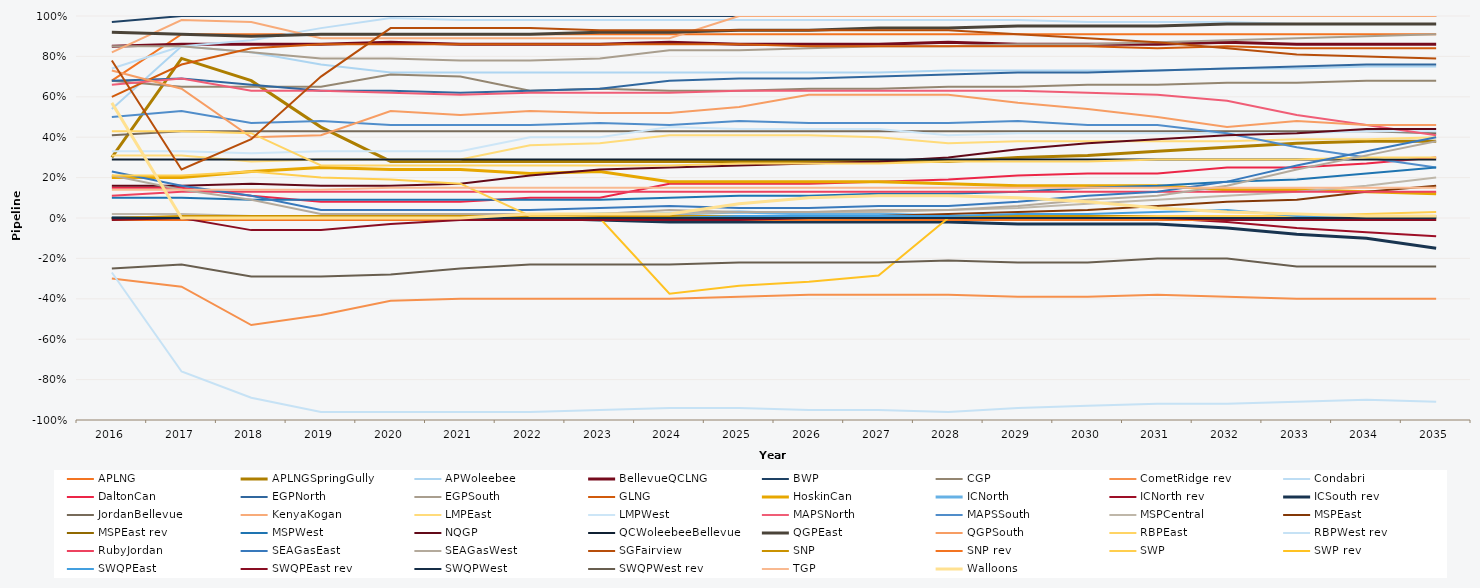
| Category | APLNG | APLNGSpringGully | APWoleebee | BellevueQCLNG | BWP | CGP | CometRidge rev | Condabri | DaltonCan | EGPNorth | EGPSouth | GLNG | HoskinCan | ICNorth | ICNorth rev | ICSouth rev | JordanBellevue | KenyaKogan | LMPEast | LMPWest | MAPSNorth | MAPSSouth | MSPCentral | MSPEast | MSPEast rev | MSPWest | NQGP | QCWoleebeeBellevue | QGPEast | QGPSouth | RBPEast | RBPWest rev | RubyJordan | SEAGasEast | SEAGasWest | SGFairview | SNP | SNP rev | SWP | SWP rev | SWQPEast | SWQPEast rev | SWQPWest | SWQPWest rev | TGP | Walloons |
|---|---|---|---|---|---|---|---|---|---|---|---|---|---|---|---|---|---|---|---|---|---|---|---|---|---|---|---|---|---|---|---|---|---|---|---|---|---|---|---|---|---|---|---|---|---|---|
| 2016.0 | 0.68 | 0.3 | 0.54 | 0.85 | 0.97 | 0.68 | -0.3 | 0.74 | 0.15 | 0.68 | 0.85 | 0.6 | 0.2 | 0 | 0 | 0 | 0.41 | 0.82 | 0.31 | 0.33 | 0.66 | 0.5 | 0.02 | 0 | 0 | 0.1 | 0.16 | 0.29 | 0.92 | 0.73 | 0.43 | -0.27 | 0.11 | 0.23 | 0.21 | 0.78 | 0 | -0.01 | 0.21 | 0 | 0 | -0.01 | 0 | -0.25 | 0.14 | 0.57 |
| 2017.0 | 0.91 | 0.79 | 0.85 | 0.86 | 1 | 0.65 | -0.34 | 0.85 | 0.15 | 0.69 | 0.85 | 0.76 | 0.2 | 0 | 0 | 0 | 0.43 | 0.98 | 0.31 | 0.33 | 0.69 | 0.53 | 0.02 | 0 | 0 | 0.1 | 0.16 | 0.29 | 0.91 | 0.64 | 0.43 | -0.76 | 0.13 | 0.16 | 0.14 | 0.24 | 0.01 | -0.01 | 0.21 | 0 | 0 | 0 | 0 | -0.23 | 0.14 | 0 |
| 2018.0 | 0.91 | 0.68 | 0.82 | 0.86 | 1 | 0.65 | -0.53 | 0.88 | 0.11 | 0.66 | 0.82 | 0.84 | 0.23 | 0 | 0 | 0 | 0.43 | 0.97 | 0.28 | 0.32 | 0.63 | 0.47 | 0.01 | 0 | 0 | 0.09 | 0.17 | 0.29 | 0.9 | 0.4 | 0.42 | -0.89 | 0.13 | 0.11 | 0.09 | 0.39 | 0.01 | -0.01 | 0.23 | 0 | 0 | -0.06 | 0 | -0.29 | 0.14 | 0 |
| 2019.0 | 0.91 | 0.45 | 0.76 | 0.86 | 1 | 0.65 | -0.48 | 0.94 | 0.08 | 0.63 | 0.79 | 0.86 | 0.25 | 0 | 0 | 0 | 0.43 | 0.89 | 0.29 | 0.33 | 0.63 | 0.48 | 0.01 | 0 | 0 | 0.09 | 0.16 | 0.29 | 0.91 | 0.41 | 0.26 | -0.96 | 0.13 | 0.04 | 0.02 | 0.7 | 0.01 | -0.01 | 0.2 | 0 | 0 | -0.06 | 0 | -0.29 | 0.14 | 0 |
| 2020.0 | 0.91 | 0.28 | 0.72 | 0.87 | 1 | 0.71 | -0.41 | 0.99 | 0.08 | 0.63 | 0.79 | 0.86 | 0.24 | 0 | 0 | 0 | 0.43 | 0.89 | 0.29 | 0.33 | 0.62 | 0.46 | 0.01 | 0 | 0 | 0.09 | 0.16 | 0.29 | 0.91 | 0.53 | 0.26 | -0.96 | 0.13 | 0.04 | 0.02 | 0.94 | 0.01 | -0.01 | 0.19 | 0 | 0 | -0.03 | 0 | -0.28 | 0.15 | 0 |
| 2021.0 | 0.91 | 0.28 | 0.72 | 0.86 | 1 | 0.7 | -0.4 | 0.98 | 0.08 | 0.62 | 0.78 | 0.86 | 0.24 | 0 | 0 | 0 | 0.43 | 0.89 | 0.29 | 0.33 | 0.61 | 0.46 | 0.01 | 0 | 0 | 0.09 | 0.17 | 0.29 | 0.91 | 0.51 | 0.26 | -0.96 | 0.13 | 0.04 | 0.02 | 0.94 | 0.01 | -0.01 | 0.17 | 0 | 0 | -0.01 | 0 | -0.25 | 0.15 | 0 |
| 2022.0 | 0.91 | 0.28 | 0.72 | 0.86 | 1 | 0.63 | -0.4 | 0.98 | 0.1 | 0.63 | 0.78 | 0.86 | 0.22 | 0.01 | 0 | 0 | 0.43 | 0.89 | 0.36 | 0.4 | 0.62 | 0.46 | 0.01 | 0 | 0 | 0.09 | 0.21 | 0.29 | 0.91 | 0.53 | 0.26 | -0.96 | 0.13 | 0.04 | 0.02 | 0.94 | 0.01 | -0.01 | 0.01 | 0 | 0 | -0.01 | 0 | -0.23 | 0.15 | 0.02 |
| 2023.0 | 0.91 | 0.28 | 0.72 | 0.86 | 1 | 0.64 | -0.4 | 0.98 | 0.1 | 0.64 | 0.79 | 0.86 | 0.23 | 0.02 | 0 | -0.01 | 0.43 | 0.89 | 0.37 | 0.4 | 0.62 | 0.47 | 0.01 | 0 | 0 | 0.09 | 0.24 | 0.29 | 0.92 | 0.52 | 0.26 | -0.95 | 0.13 | 0.05 | 0.02 | 0.93 | 0.01 | -0.01 | 0 | 0 | 0 | -0.01 | 0 | -0.23 | 0.15 | 0.02 |
| 2024.0 | 0.91 | 0.28 | 0.72 | 0.87 | 1 | 0.63 | -0.4 | 0.98 | 0.17 | 0.68 | 0.83 | 0.86 | 0.18 | 0.02 | 0 | -0.02 | 0.43 | 0.89 | 0.41 | 0.45 | 0.62 | 0.46 | 0.02 | 0 | 0 | 0.1 | 0.25 | 0.29 | 0.92 | 0.52 | 0.26 | -0.94 | 0.13 | 0.06 | 0.04 | 0.93 | 0.01 | -0.01 | 0 | -0.375 | 0 | -0.01 | 0 | -0.23 | 0.15 | 0.02 |
| 2025.0 | 0.91 | 0.28 | 0.72 | 0.86 | 1 | 0.63 | -0.39 | 0.98 | 0.17 | 0.69 | 0.83 | 0.86 | 0.18 | 0.03 | 0 | -0.02 | 0.43 | 1 | 0.41 | 0.44 | 0.63 | 0.48 | 0.03 | 0.01 | 0 | 0.11 | 0.26 | 0.29 | 0.93 | 0.55 | 0.27 | -0.94 | 0.13 | 0.05 | 0.03 | 0.93 | 0.01 | -0.01 | 0 | -0.335 | 0.01 | -0.01 | 0 | -0.22 | 0.15 | 0.07 |
| 2026.0 | 0.91 | 0.28 | 0.72 | 0.86 | 1 | 0.64 | -0.38 | 0.98 | 0.17 | 0.69 | 0.84 | 0.85 | 0.18 | 0.02 | 0 | -0.02 | 0.43 | 1 | 0.41 | 0.44 | 0.63 | 0.47 | 0.03 | 0.01 | 0 | 0.11 | 0.27 | 0.29 | 0.93 | 0.61 | 0.27 | -0.95 | 0.13 | 0.05 | 0.03 | 0.93 | 0.01 | -0.01 | 0 | -0.315 | 0.01 | 0 | 0 | -0.22 | 0.15 | 0.1 |
| 2027.0 | 0.91 | 0.28 | 0.72 | 0.86 | 1 | 0.64 | -0.38 | 0.98 | 0.18 | 0.7 | 0.85 | 0.85 | 0.18 | 0.02 | 0 | -0.02 | 0.43 | 1 | 0.4 | 0.44 | 0.63 | 0.47 | 0.03 | 0.01 | 0 | 0.12 | 0.28 | 0.29 | 0.94 | 0.61 | 0.27 | -0.95 | 0.13 | 0.06 | 0.04 | 0.93 | 0.01 | -0.01 | 0 | -0.285 | 0.01 | 0 | 0 | -0.22 | 0.15 | 0.11 |
| 2028.0 | 0.91 | 0.28 | 0.73 | 0.87 | 1 | 0.65 | -0.38 | 0.98 | 0.19 | 0.71 | 0.85 | 0.85 | 0.17 | 0.01 | 0 | -0.02 | 0.43 | 1 | 0.37 | 0.41 | 0.63 | 0.47 | 0.04 | 0.02 | 0 | 0.12 | 0.3 | 0.29 | 0.94 | 0.61 | 0.28 | -0.96 | 0.13 | 0.06 | 0.04 | 0.93 | 0.01 | -0.01 | 0 | 0 | 0.01 | 0 | 0 | -0.21 | 0.15 | 0.11 |
| 2029.0 | 0.91 | 0.3 | 0.73 | 0.86 | 1 | 0.65 | -0.39 | 0.98 | 0.21 | 0.72 | 0.86 | 0.85 | 0.16 | 0 | 0 | -0.03 | 0.43 | 1 | 0.38 | 0.42 | 0.63 | 0.48 | 0.05 | 0.03 | 0 | 0.13 | 0.34 | 0.29 | 0.95 | 0.57 | 0.28 | -0.94 | 0.13 | 0.08 | 0.06 | 0.91 | 0.01 | -0.01 | 0 | 0 | 0.02 | 0 | 0 | -0.22 | 0.15 | 0.1 |
| 2030.0 | 0.91 | 0.31 | 0.73 | 0.86 | 1 | 0.66 | -0.39 | 0.97 | 0.22 | 0.72 | 0.86 | 0.85 | 0.16 | 0 | 0 | -0.03 | 0.43 | 1 | 0.38 | 0.42 | 0.62 | 0.46 | 0.07 | 0.04 | 0 | 0.15 | 0.37 | 0.29 | 0.95 | 0.54 | 0.28 | -0.93 | 0.13 | 0.11 | 0.09 | 0.89 | 0.01 | -0.01 | 0 | 0 | 0.02 | 0 | 0 | -0.22 | 0.15 | 0.08 |
| 2031.0 | 0.91 | 0.33 | 0.73 | 0.86 | 1 | 0.66 | -0.38 | 0.97 | 0.22 | 0.73 | 0.87 | 0.84 | 0.16 | 0 | 0 | -0.03 | 0.43 | 1 | 0.38 | 0.42 | 0.61 | 0.46 | 0.09 | 0.06 | 0 | 0.16 | 0.39 | 0.29 | 0.95 | 0.5 | 0.29 | -0.92 | 0.13 | 0.13 | 0.11 | 0.87 | 0.01 | -0.01 | 0.01 | 0 | 0.03 | 0 | 0 | -0.2 | 0.15 | 0.05 |
| 2032.0 | 0.91 | 0.35 | 0.74 | 0.87 | 1 | 0.67 | -0.39 | 0.97 | 0.25 | 0.74 | 0.88 | 0.85 | 0.14 | 0 | -0.02 | -0.05 | 0.43 | 1 | 0.38 | 0.42 | 0.58 | 0.42 | 0.11 | 0.08 | 0 | 0.18 | 0.41 | 0.29 | 0.96 | 0.45 | 0.29 | -0.92 | 0.13 | 0.18 | 0.16 | 0.84 | 0.01 | -0.01 | 0.01 | 0 | 0.04 | -0.01 | 0 | -0.2 | 0.15 | 0.03 |
| 2033.0 | 0.91 | 0.37 | 0.74 | 0.86 | 1 | 0.67 | -0.4 | 0.96 | 0.25 | 0.75 | 0.89 | 0.84 | 0.14 | 0 | -0.05 | -0.08 | 0.43 | 1 | 0.39 | 0.42 | 0.51 | 0.35 | 0.13 | 0.09 | 0 | 0.19 | 0.42 | 0.29 | 0.96 | 0.48 | 0.29 | -0.91 | 0.13 | 0.26 | 0.24 | 0.81 | 0.01 | -0.01 | 0.01 | 0 | 0.01 | -0.01 | 0 | -0.24 | 0.15 | 0.02 |
| 2034.0 | 0.91 | 0.38 | 0.75 | 0.86 | 1 | 0.68 | -0.4 | 0.96 | 0.27 | 0.76 | 0.9 | 0.84 | 0.13 | 0 | -0.07 | -0.1 | 0.43 | 1 | 0.39 | 0.43 | 0.46 | 0.3 | 0.16 | 0.13 | 0 | 0.22 | 0.44 | 0.29 | 0.96 | 0.46 | 0.3 | -0.9 | 0.13 | 0.33 | 0.31 | 0.8 | 0.01 | -0.01 | 0.02 | 0 | 0.01 | -0.01 | 0 | -0.24 | 0.15 | 0.01 |
| 2035.0 | 0.91 | 0.38 | 0.75 | 0.86 | 1 | 0.68 | -0.4 | 0.96 | 0.3 | 0.76 | 0.91 | 0.84 | 0.12 | 0 | -0.09 | -0.15 | 0.42 | 1 | 0.4 | 0.43 | 0.41 | 0.25 | 0.2 | 0.16 | 0 | 0.25 | 0.44 | 0.29 | 0.96 | 0.46 | 0.3 | -0.91 | 0.13 | 0.4 | 0.38 | 0.79 | 0.01 | -0.01 | 0.03 | 0 | 0.01 | -0.01 | 0 | -0.24 | 0.15 | 0.01 |